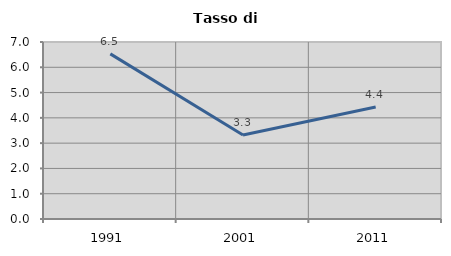
| Category | Tasso di disoccupazione   |
|---|---|
| 1991.0 | 6.531 |
| 2001.0 | 3.324 |
| 2011.0 | 4.43 |